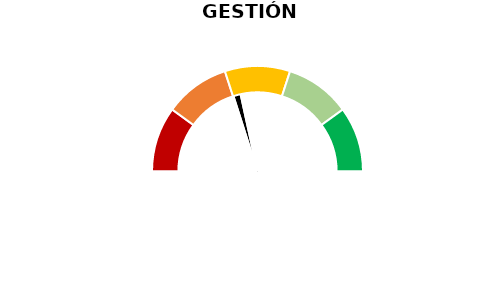
| Category | Puntero |
|---|---|
| 0 | 40.167 |
| 1 | 3 |
| 2 | 156.833 |